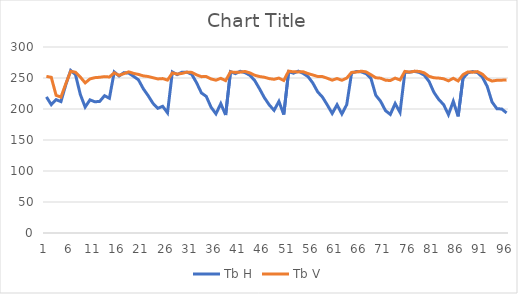
| Category | Tb H | Tb V |
|---|---|---|
| 0 | 219.513 | 252.62 |
| 1 | 207.066 | 251.094 |
| 2 | 215.075 | 222.028 |
| 3 | 211.916 | 219.199 |
| 4 | 239.164 | 240.692 |
| 5 | 262.247 | 260.732 |
| 6 | 255.4 | 259.313 |
| 7 | 223.398 | 251.487 |
| 8 | 203.1 | 242.127 |
| 9 | 214.748 | 248.546 |
| 10 | 211.633 | 250.548 |
| 11 | 212.244 | 251.174 |
| 12 | 221.478 | 252.223 |
| 13 | 217.292 | 251.646 |
| 14 | 259.74 | 258.302 |
| 15 | 253.217 | 254.329 |
| 16 | 258.629 | 257.021 |
| 17 | 257.796 | 259.929 |
| 18 | 252.611 | 257.393 |
| 19 | 247.078 | 255.788 |
| 20 | 232.688 | 253.421 |
| 21 | 221.5 | 252.434 |
| 22 | 209.119 | 250.467 |
| 23 | 201.111 | 248.484 |
| 24 | 204.388 | 249.06 |
| 25 | 193.805 | 246.622 |
| 26 | 259.74 | 258.178 |
| 27 | 255.406 | 256.375 |
| 28 | 259.429 | 257.4 |
| 29 | 259.461 | 259.53 |
| 30 | 255.927 | 259.053 |
| 31 | 242.323 | 255.008 |
| 32 | 225.926 | 252.188 |
| 33 | 220.301 | 252.34 |
| 34 | 202.774 | 248.46 |
| 35 | 192.184 | 246.51 |
| 36 | 208.626 | 249.469 |
| 37 | 190.33 | 245.786 |
| 38 | 260.212 | 259.844 |
| 39 | 257.08 | 259.042 |
| 40 | 260.802 | 259.475 |
| 41 | 258.565 | 260.549 |
| 42 | 254.431 | 258.254 |
| 43 | 245.933 | 254.456 |
| 44 | 232.578 | 252.381 |
| 45 | 218.206 | 251.232 |
| 46 | 206.698 | 248.993 |
| 47 | 197.854 | 247.889 |
| 48 | 212.301 | 249.861 |
| 49 | 191.098 | 245.97 |
| 50 | 260.211 | 261.123 |
| 51 | 257.731 | 259.919 |
| 52 | 261.042 | 259.856 |
| 53 | 257.499 | 260.073 |
| 54 | 252.269 | 257.149 |
| 55 | 241.875 | 254.877 |
| 56 | 227.648 | 252.468 |
| 57 | 219.075 | 252.27 |
| 58 | 206.429 | 249.525 |
| 59 | 192.797 | 246.517 |
| 60 | 206.886 | 249.101 |
| 61 | 191.965 | 246.351 |
| 62 | 207.116 | 249.848 |
| 63 | 257.926 | 259.05 |
| 64 | 260.495 | 259.577 |
| 65 | 259.965 | 261.052 |
| 66 | 256.913 | 259.841 |
| 67 | 249.196 | 255.229 |
| 68 | 222.127 | 250.406 |
| 69 | 212.344 | 249.705 |
| 70 | 197.414 | 246.5 |
| 71 | 191.244 | 245.882 |
| 72 | 208.808 | 249.772 |
| 73 | 194.571 | 246.854 |
| 74 | 259.103 | 260.654 |
| 75 | 259.4 | 259.495 |
| 76 | 260.771 | 260.889 |
| 77 | 258.871 | 260.595 |
| 78 | 254.615 | 258.318 |
| 79 | 244.361 | 252.692 |
| 80 | 226.854 | 250.368 |
| 81 | 215.363 | 249.86 |
| 82 | 207.08 | 248.739 |
| 83 | 190.872 | 245.459 |
| 84 | 212.492 | 249.546 |
| 85 | 188.105 | 245.244 |
| 86 | 249.315 | 255.357 |
| 87 | 258.209 | 259.751 |
| 88 | 260.405 | 259.409 |
| 89 | 258.714 | 260.318 |
| 90 | 251.39 | 256.15 |
| 91 | 236.538 | 248.545 |
| 92 | 211.295 | 245.07 |
| 93 | 200.497 | 246.305 |
| 94 | 200.009 | 246.497 |
| 95 | 193.667 | 246.906 |